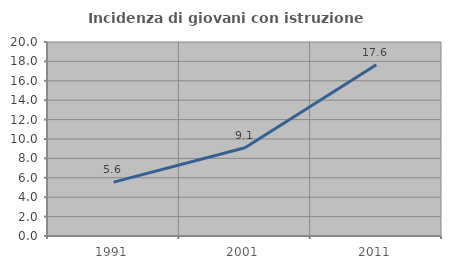
| Category | Incidenza di giovani con istruzione universitaria |
|---|---|
| 1991.0 | 5.556 |
| 2001.0 | 9.091 |
| 2011.0 | 17.647 |